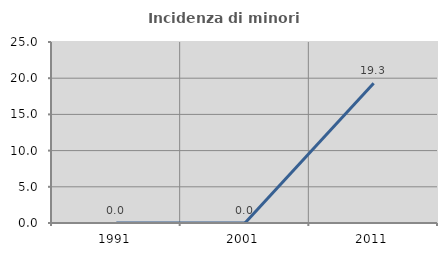
| Category | Incidenza di minori stranieri |
|---|---|
| 1991.0 | 0 |
| 2001.0 | 0 |
| 2011.0 | 19.298 |